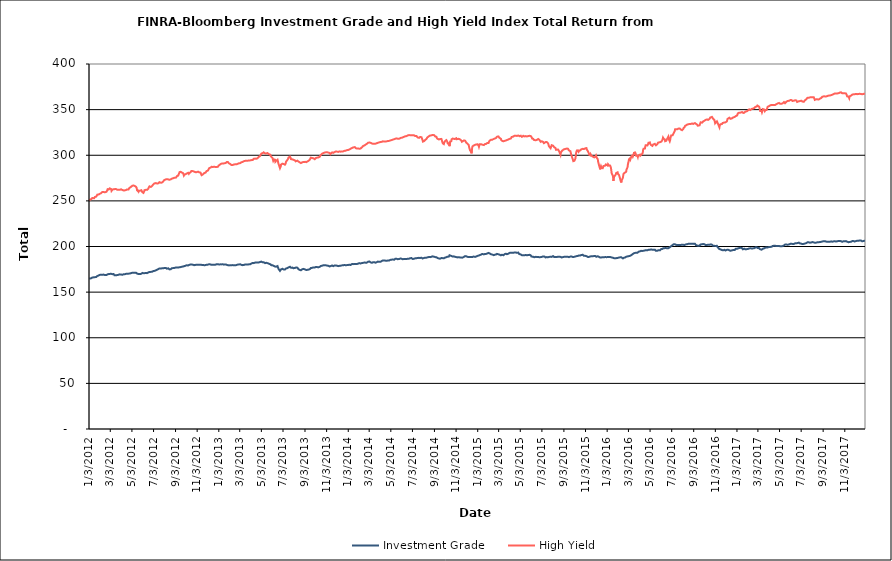
| Category | Investment Grade | High Yield |
|---|---|---|
| 1/3/12 | 165 | 250.715 |
| 1/4/12 | 164.79 | 250.779 |
| 1/5/12 | 164.735 | 251.086 |
| 1/6/12 | 164.96 | 251.448 |
| 1/9/12 | 165.268 | 251.961 |
| 1/10/12 | 165.441 | 252.742 |
| 1/11/12 | 165.803 | 252.832 |
| 1/12/12 | 166.032 | 253.184 |
| 1/13/12 | 166.183 | 253.02 |
| 1/17/12 | 166.274 | 252.866 |
| 1/18/12 | 166.444 | 253.06 |
| 1/19/12 | 166.456 | 254.263 |
| 1/20/12 | 166.437 | 254.397 |
| 1/23/12 | 166.529 | 254.743 |
| 1/24/12 | 166.417 | 254.88 |
| 1/25/12 | 166.929 | 255.446 |
| 1/26/12 | 167.686 | 256.822 |
| 1/27/12 | 167.976 | 256.959 |
| 1/30/12 | 168.315 | 257.005 |
| 1/31/12 | 168.58 | 256.808 |
| 2/1/12 | 168.573 | 257.523 |
| 2/2/12 | 168.91 | 257.778 |
| 2/3/12 | 168.745 | 257.951 |
| 2/6/12 | 169.019 | 258.538 |
| 2/7/12 | 168.872 | 258.607 |
| 2/8/12 | 169.153 | 259.455 |
| 2/9/12 | 168.938 | 259.817 |
| 2/10/12 | 169.066 | 259.132 |
| 2/13/12 | 169.249 | 259.743 |
| 2/14/12 | 169.29 | 259.486 |
| 2/15/12 | 169.329 | 259.581 |
| 2/16/12 | 168.702 | 259.357 |
| 2/17/12 | 168.808 | 260.074 |
| 2/21/12 | 168.807 | 260.076 |
| 2/22/12 | 169.006 | 260.884 |
| 2/23/12 | 169.182 | 261.495 |
| 2/24/12 | 169.517 | 262.8 |
| 2/27/12 | 169.832 | 262.498 |
| 2/28/12 | 170.084 | 262.863 |
| 2/29/12 | 170.208 | 263.462 |
| 3/1/12 | 169.958 | 263.656 |
| 3/2/12 | 170.404 | 263.482 |
| 3/5/12 | 170.096 | 262.963 |
| 3/6/12 | 169.911 | 260.954 |
| 3/7/12 | 169.867 | 261.475 |
| 3/8/12 | 169.702 | 261.711 |
| 3/9/12 | 169.585 | 262.512 |
| 3/12/12 | 169.759 | 262.676 |
| 3/13/12 | 169.338 | 262.921 |
| 3/14/12 | 168.604 | 263.168 |
| 3/15/12 | 168.553 | 262.878 |
| 3/16/12 | 168.639 | 262.992 |
| 3/19/12 | 168.542 | 262.878 |
| 3/20/12 | 168.348 | 262.477 |
| 3/21/12 | 168.765 | 262.877 |
| 3/22/12 | 168.674 | 262.254 |
| 3/23/12 | 168.965 | 262.017 |
| 3/26/12 | 169.026 | 262.319 |
| 3/27/12 | 169.446 | 262.573 |
| 3/28/12 | 169.432 | 262.566 |
| 3/29/12 | 169.464 | 262.104 |
| 3/30/12 | 169.412 | 262.581 |
| 4/2/12 | 169.408 | 262.705 |
| 4/3/12 | 169.271 | 262.827 |
| 4/4/12 | 168.83 | 262.433 |
| 4/5/12 | 168.956 | 262 |
| 4/9/12 | 169.563 | 261.491 |
| 4/10/12 | 169.66 | 260.789 |
| 4/11/12 | 169.504 | 260.797 |
| 4/12/12 | 169.575 | 261.504 |
| 4/13/12 | 169.893 | 261.894 |
| 4/16/12 | 170.079 | 261.862 |
| 4/17/12 | 169.995 | 262.478 |
| 4/18/12 | 170.068 | 262.661 |
| 4/19/12 | 170.194 | 262.593 |
| 4/20/12 | 170.075 | 262.792 |
| 4/23/12 | 170.258 | 262.506 |
| 4/24/12 | 170.151 | 263.114 |
| 4/25/12 | 170.052 | 263.997 |
| 4/26/12 | 170.32 | 264.193 |
| 4/27/12 | 170.504 | 264.573 |
| 4/30/12 | 170.798 | 265.38 |
| 5/1/12 | 170.791 | 266.079 |
| 5/2/12 | 171.05 | 266.388 |
| 5/3/12 | 171.183 | 266.464 |
| 5/4/12 | 171.332 | 266.529 |
| 5/7/12 | 171.284 | 266.86 |
| 5/8/12 | 171.473 | 266.486 |
| 5/9/12 | 171.253 | 266.124 |
| 5/10/12 | 171.161 | 266.473 |
| 5/11/12 | 171.321 | 266.48 |
| 5/14/12 | 171.318 | 265.403 |
| 5/15/12 | 171.144 | 265.259 |
| 5/16/12 | 170.604 | 264.152 |
| 5/17/12 | 170.27 | 261.717 |
| 5/18/12 | 169.962 | 260.994 |
| 5/21/12 | 169.887 | 259.995 |
| 5/22/12 | 169.745 | 261.241 |
| 5/23/12 | 169.888 | 260.549 |
| 5/24/12 | 169.74 | 260.698 |
| 5/25/12 | 169.974 | 261.09 |
| 5/29/12 | 170.104 | 261.678 |
| 5/30/12 | 170.523 | 261.215 |
| 5/31/12 | 170.894 | 260.94 |
| 6/1/12 | 171.018 | 259.478 |
| 6/4/12 | 170.775 | 258.736 |
| 6/5/12 | 170.482 | 258.384 |
| 6/6/12 | 170.426 | 260.187 |
| 6/7/12 | 170.775 | 261.74 |
| 6/8/12 | 170.965 | 261.457 |
| 6/11/12 | 171.032 | 262.151 |
| 6/12/12 | 170.646 | 261.8 |
| 6/13/12 | 170.807 | 262.045 |
| 6/14/12 | 170.791 | 262.064 |
| 6/15/12 | 171.482 | 262.908 |
| 6/18/12 | 171.637 | 263.399 |
| 6/19/12 | 171.659 | 264.743 |
| 6/20/12 | 171.768 | 265.827 |
| 6/21/12 | 172.115 | 265.94 |
| 6/22/12 | 172.025 | 265.728 |
| 6/25/12 | 172.199 | 265.279 |
| 6/26/12 | 172.058 | 265.524 |
| 6/27/12 | 172.152 | 265.968 |
| 6/28/12 | 172.304 | 266.213 |
| 6/29/12 | 172.257 | 267.309 |
| 7/2/12 | 173.09 | 268.096 |
| 7/3/12 | 173.221 | 268.752 |
| 7/5/12 | 173.316 | 269.146 |
| 7/6/12 | 173.56 | 269.538 |
| 7/9/12 | 173.833 | 269.493 |
| 7/10/12 | 174.086 | 269.579 |
| 7/11/12 | 174.259 | 269.722 |
| 7/12/12 | 174.453 | 269.04 |
| 7/13/12 | 174.699 | 269.154 |
| 7/16/12 | 175.24 | 269.239 |
| 7/17/12 | 175.328 | 269.334 |
| 7/18/12 | 175.845 | 269.69 |
| 7/19/12 | 175.973 | 270.505 |
| 7/20/12 | 175.936 | 270.235 |
| 7/23/12 | 175.822 | 269.894 |
| 7/24/12 | 176.004 | 269.604 |
| 7/25/12 | 176.025 | 269.406 |
| 7/26/12 | 176.118 | 270.041 |
| 7/27/12 | 175.687 | 270.63 |
| 7/30/12 | 176.107 | 271.303 |
| 7/31/12 | 176.44 | 272.05 |
| 8/1/12 | 176.338 | 272.672 |
| 8/2/12 | 176.512 | 272.465 |
| 8/3/12 | 176.119 | 272.799 |
| 8/6/12 | 176.532 | 273.572 |
| 8/7/12 | 176.104 | 274.005 |
| 8/8/12 | 175.944 | 273.748 |
| 8/9/12 | 175.686 | 273.786 |
| 8/10/12 | 176.002 | 273.401 |
| 8/13/12 | 176.09 | 273.532 |
| 8/14/12 | 175.65 | 273.594 |
| 8/15/12 | 175.071 | 273.101 |
| 8/16/12 | 174.906 | 273.147 |
| 8/17/12 | 174.987 | 273.072 |
| 8/20/12 | 175.143 | 273.57 |
| 8/21/12 | 175.21 | 274.034 |
| 8/22/12 | 175.778 | 274.203 |
| 8/23/12 | 176.169 | 274.362 |
| 8/24/12 | 176.127 | 274.551 |
| 8/27/12 | 176.358 | 274.825 |
| 8/28/12 | 176.454 | 275.031 |
| 8/29/12 | 176.284 | 274.914 |
| 8/30/12 | 176.477 | 275.32 |
| 8/31/12 | 176.81 | 275.392 |
| 9/4/12 | 177.032 | 275.567 |
| 9/5/12 | 176.91 | 275.631 |
| 9/6/12 | 176.68 | 276.312 |
| 9/7/12 | 177.103 | 277.344 |
| 9/10/12 | 177.002 | 277.72 |
| 9/11/12 | 177.098 | 278.556 |
| 9/12/12 | 177.05 | 279.736 |
| 9/13/12 | 177.212 | 280.396 |
| 9/14/12 | 177.169 | 281.535 |
| 9/17/12 | 177.454 | 281.887 |
| 9/18/12 | 177.646 | 281.586 |
| 9/19/12 | 177.912 | 281.618 |
| 9/20/12 | 177.78 | 281.149 |
| 9/21/12 | 177.838 | 281.063 |
| 9/24/12 | 178.1 | 280.276 |
| 9/25/12 | 178.087 | 279.718 |
| 9/26/12 | 178.216 | 277.714 |
| 9/27/12 | 178.469 | 278.535 |
| 9/28/12 | 178.688 | 278.908 |
| 10/1/12 | 178.975 | 279.276 |
| 10/2/12 | 179.149 | 279.208 |
| 10/3/12 | 179.331 | 279.587 |
| 10/4/12 | 179.471 | 279.992 |
| 10/5/12 | 179.287 | 280.375 |
| 10/8/12 | 179.17 | 280.811 |
| 10/9/12 | 179.42 | 280.214 |
| 10/10/12 | 179.403 | 279.596 |
| 10/11/12 | 179.787 | 280.444 |
| 10/12/12 | 180.286 | 280.729 |
| 10/15/12 | 180.386 | 281.353 |
| 10/16/12 | 180.411 | 281.917 |
| 10/17/12 | 180.427 | 282.705 |
| 10/18/12 | 180.252 | 282.93 |
| 10/19/12 | 180.181 | 282.592 |
| 10/22/12 | 179.984 | 282.579 |
| 10/23/12 | 179.808 | 281.491 |
| 10/24/12 | 179.787 | 281.88 |
| 10/25/12 | 179.532 | 282.013 |
| 10/26/12 | 179.776 | 281.343 |
| 10/29/12 | 179.874 | 281.464 |
| 10/30/12 | 179.896 | 281.521 |
| 10/31/12 | 180.158 | 281.409 |
| 11/1/12 | 180.105 | 281.505 |
| 11/2/12 | 180.019 | 281.845 |
| 11/5/12 | 180.13 | 282.006 |
| 11/6/12 | 179.794 | 282.389 |
| 11/7/12 | 179.95 | 281.412 |
| 11/8/12 | 180.011 | 281.342 |
| 11/9/12 | 179.956 | 280.712 |
| 11/12/12 | 179.993 | 281.011 |
| 11/13/12 | 180.036 | 279.914 |
| 11/14/12 | 180.015 | 279.447 |
| 11/15/12 | 179.863 | 278.145 |
| 11/16/12 | 179.799 | 277.878 |
| 11/19/12 | 179.795 | 279.127 |
| 11/20/12 | 179.615 | 279.948 |
| 11/21/12 | 179.343 | 280.164 |
| 11/23/12 | 179.415 | 280.637 |
| 11/26/12 | 179.727 | 280.898 |
| 11/27/12 | 179.835 | 281.598 |
| 11/28/12 | 179.951 | 281.767 |
| 11/29/12 | 179.975 | 282.593 |
| 11/30/12 | 180.118 | 283.394 |
| 12/3/12 | 180.152 | 283.319 |
| 12/4/12 | 180.225 | 283.828 |
| 12/5/12 | 180.496 | 284.899 |
| 12/6/12 | 180.562 | 285.395 |
| 12/7/12 | 180.315 | 286.027 |
| 12/10/12 | 180.348 | 286.385 |
| 12/11/12 | 180.223 | 286.768 |
| 12/12/12 | 180.123 | 287.14 |
| 12/13/12 | 179.907 | 287.331 |
| 12/14/12 | 180.071 | 287.179 |
| 12/17/12 | 179.933 | 287.169 |
| 12/18/12 | 179.627 | 287.436 |
| 12/19/12 | 179.934 | 287.562 |
| 12/20/12 | 179.999 | 287.474 |
| 12/21/12 | 180.203 | 286.963 |
| 12/24/12 | 180.079 | 287.133 |
| 12/26/12 | 180.197 | 286.749 |
| 12/27/12 | 180.542 | 287.091 |
| 12/28/12 | 180.711 | 287.206 |
| 12/31/12 | 180.615 | 287.373 |
| 1/2/13 | 180.418 | 288.714 |
| 1/3/13 | 180.314 | 289.229 |
| 1/4/13 | 180.218 | 289.691 |
| 1/7/13 | 180.416 | 290.115 |
| 1/8/13 | 180.534 | 290.229 |
| 1/9/13 | 180.497 | 290.492 |
| 1/10/13 | 180.403 | 290.811 |
| 1/11/13 | 180.366 | 291.068 |
| 1/14/13 | 180.474 | 290.972 |
| 1/15/13 | 180.457 | 290.556 |
| 1/16/13 | 180.451 | 290.825 |
| 1/17/13 | 180.126 | 291.101 |
| 1/18/13 | 180.262 | 291.424 |
| 1/22/13 | 180.359 | 291.542 |
| 1/23/13 | 180.414 | 291.942 |
| 1/24/13 | 180.258 | 292.239 |
| 1/25/13 | 179.88 | 292.639 |
| 1/28/13 | 179.528 | 292.699 |
| 1/29/13 | 179.475 | 291.968 |
| 1/30/13 | 179.216 | 291.435 |
| 1/31/13 | 179.282 | 290.547 |
| 2/1/13 | 179.319 | 290.795 |
| 2/4/13 | 179.396 | 290.328 |
| 2/5/13 | 179.186 | 289.927 |
| 2/6/13 | 179.33 | 289.626 |
| 2/7/13 | 179.53 | 289.348 |
| 2/8/13 | 179.424 | 289.123 |
| 2/11/13 | 179.601 | 289.312 |
| 2/12/13 | 179.432 | 289.517 |
| 2/13/13 | 179.276 | 289.685 |
| 2/14/13 | 179.47 | 289.903 |
| 2/15/13 | 179.428 | 289.938 |
| 2/19/13 | 179.436 | 290.138 |
| 2/20/13 | 179.393 | 290.311 |
| 2/21/13 | 179.67 | 289.894 |
| 2/22/13 | 179.791 | 290.126 |
| 2/25/13 | 180.195 | 290.674 |
| 2/26/13 | 180.36 | 290.49 |
| 2/27/13 | 180.275 | 290.647 |
| 2/28/13 | 180.295 | 291.129 |
| 3/1/13 | 180.498 | 291.056 |
| 3/4/13 | 180.547 | 291.371 |
| 3/5/13 | 180.405 | 292.183 |
| 3/6/13 | 180.162 | 292.263 |
| 3/7/13 | 179.864 | 292.342 |
| 3/8/13 | 179.491 | 292.364 |
| 3/11/13 | 179.561 | 292.71 |
| 3/12/13 | 179.833 | 292.986 |
| 3/13/13 | 179.763 | 292.997 |
| 3/14/13 | 179.781 | 293.521 |
| 3/15/13 | 180.017 | 293.66 |
| 3/18/13 | 180.309 | 293.843 |
| 3/19/13 | 180.56 | 293.925 |
| 3/20/13 | 180.234 | 294.009 |
| 3/21/13 | 180.19 | 293.882 |
| 3/22/13 | 180.169 | 293.97 |
| 3/25/13 | 180.202 | 294.027 |
| 3/26/13 | 180.105 | 293.998 |
| 3/27/13 | 180.419 | 294.128 |
| 3/28/13 | 180.443 | 294.272 |
| 4/1/13 | 180.531 | 294.371 |
| 4/2/13 | 180.461 | 294.579 |
| 4/3/13 | 180.789 | 294.607 |
| 4/4/13 | 181.285 | 294.648 |
| 4/5/13 | 181.945 | 294.632 |
| 4/8/13 | 182.004 | 294.735 |
| 4/9/13 | 182.049 | 295.329 |
| 4/10/13 | 181.764 | 295.607 |
| 4/11/13 | 181.777 | 296.149 |
| 4/12/13 | 182.134 | 296.506 |
| 4/15/13 | 182.382 | 296.343 |
| 4/16/13 | 182.309 | 296.556 |
| 4/17/13 | 182.364 | 296.241 |
| 4/18/13 | 182.416 | 296.14 |
| 4/19/13 | 182.332 | 296.394 |
| 4/22/13 | 182.498 | 296.78 |
| 4/23/13 | 182.612 | 297.392 |
| 4/24/13 | 182.699 | 297.751 |
| 4/25/13 | 182.517 | 298.19 |
| 4/26/13 | 182.907 | 298.71 |
| 4/29/13 | 183.005 | 299.268 |
| 4/30/13 | 183.021 | 300.067 |
| 5/1/13 | 183.331 | 300.856 |
| 5/2/13 | 183.461 | 301.386 |
| 5/3/13 | 182.88 | 301.968 |
| 5/6/13 | 182.703 | 302.267 |
| 5/7/13 | 182.682 | 302.749 |
| 5/8/13 | 182.755 | 303.216 |
| 5/9/13 | 182.747 | 303.174 |
| 5/10/13 | 182.048 | 302.716 |
| 5/13/13 | 181.775 | 302.027 |
| 5/14/13 | 181.74 | 301.767 |
| 5/15/13 | 181.725 | 301.705 |
| 5/16/13 | 182.182 | 302.013 |
| 5/17/13 | 181.879 | 302.136 |
| 5/20/13 | 181.74 | 302.424 |
| 5/21/13 | 181.831 | 302.406 |
| 5/22/13 | 181.51 | 302.291 |
| 5/23/13 | 181.254 | 301.321 |
| 5/24/13 | 181.269 | 300.988 |
| 5/28/13 | 180.478 | 300.573 |
| 5/29/13 | 179.983 | 298.941 |
| 5/30/13 | 179.917 | 298.874 |
| 5/31/13 | 179.394 | 298.159 |
| 6/3/13 | 179.454 | 296.868 |
| 6/4/13 | 179.162 | 296.146 |
| 6/5/13 | 178.829 | 293.959 |
| 6/6/13 | 178.861 | 293.342 |
| 6/7/13 | 178.695 | 295.478 |
| 6/10/13 | 178.13 | 295.107 |
| 6/11/13 | 177.577 | 292.825 |
| 6/12/13 | 177.663 | 293.39 |
| 6/13/13 | 177.842 | 292.841 |
| 6/14/13 | 178.613 | 294.18 |
| 6/17/13 | 178.554 | 295.091 |
| 6/18/13 | 178.04 | 294.81 |
| 6/19/13 | 177.631 | 294.581 |
| 6/20/13 | 175.366 | 290.384 |
| 6/21/13 | 174.752 | 289.646 |
| 6/24/13 | 173.249 | 285.828 |
| 6/25/13 | 173.543 | 286.221 |
| 6/26/13 | 174.232 | 287.65 |
| 6/27/13 | 174.959 | 289.73 |
| 6/28/13 | 175.137 | 290.228 |
| 7/1/13 | 175.576 | 290.788 |
| 7/2/13 | 175.941 | 291.105 |
| 7/3/13 | 175.988 | 290.585 |
| 7/5/13 | 174.738 | 290.273 |
| 7/8/13 | 174.822 | 289.667 |
| 7/9/13 | 175.184 | 290.346 |
| 7/10/13 | 175.151 | 290.844 |
| 7/11/13 | 175.898 | 292.926 |
| 7/12/13 | 176.14 | 293.609 |
| 7/15/13 | 176.351 | 294.919 |
| 7/16/13 | 176.666 | 295.47 |
| 7/17/13 | 177.121 | 296.161 |
| 7/18/13 | 177.12 | 297.519 |
| 7/19/13 | 177.42 | 297.862 |
| 7/22/13 | 177.769 | 298.556 |
| 7/23/13 | 177.698 | 298.585 |
| 7/24/13 | 176.991 | 297.183 |
| 7/25/13 | 176.669 | 295.729 |
| 7/26/13 | 177.005 | 295.673 |
| 7/29/13 | 176.886 | 295.5 |
| 7/30/13 | 176.857 | 295.631 |
| 7/31/13 | 176.508 | 295.054 |
| 8/1/13 | 176.191 | 295.026 |
| 8/2/13 | 176.666 | 294.693 |
| 8/5/13 | 176.529 | 294.436 |
| 8/6/13 | 176.451 | 293.84 |
| 8/7/13 | 176.654 | 293.33 |
| 8/8/13 | 176.91 | 293.6 |
| 8/9/13 | 176.889 | 293.805 |
| 8/12/13 | 176.834 | 294.05 |
| 8/13/13 | 176.01 | 293.634 |
| 8/14/13 | 175.868 | 293.796 |
| 8/15/13 | 175.063 | 293.112 |
| 8/16/13 | 174.752 | 292.875 |
| 8/19/13 | 174.276 | 292.095 |
| 8/20/13 | 174.561 | 291.862 |
| 8/21/13 | 174.282 | 291.78 |
| 8/22/13 | 173.987 | 291.473 |
| 8/23/13 | 174.557 | 291.996 |
| 8/26/13 | 175.088 | 292.307 |
| 8/27/13 | 175.55 | 292.162 |
| 8/28/13 | 175.33 | 292.241 |
| 8/29/13 | 175.469 | 292.563 |
| 8/30/13 | 175.752 | 293.08 |
| 9/3/13 | 174.857 | 292.778 |
| 9/4/13 | 174.803 | 292.764 |
| 9/5/13 | 173.839 | 292.314 |
| 9/6/13 | 174.212 | 292.438 |
| 9/9/13 | 174.432 | 293.107 |
| 9/10/13 | 174.027 | 293 |
| 9/11/13 | 174.23 | 293.246 |
| 9/12/13 | 174.624 | 293.821 |
| 9/13/13 | 174.528 | 294.088 |
| 9/16/13 | 175.136 | 295.082 |
| 9/17/13 | 175.056 | 295.217 |
| 9/18/13 | 175.426 | 295.876 |
| 9/19/13 | 176.394 | 297.362 |
| 9/20/13 | 176.442 | 297.438 |
| 9/23/13 | 176.64 | 296.94 |
| 9/24/13 | 177.073 | 297.042 |
| 9/25/13 | 177.29 | 296.788 |
| 9/26/13 | 177.116 | 296.649 |
| 9/27/13 | 177.17 | 296.298 |
| 9/30/13 | 177.029 | 295.684 |
| 10/1/13 | 177.035 | 296.078 |
| 10/2/13 | 177.315 | 296.334 |
| 10/3/13 | 177.535 | 296.928 |
| 10/4/13 | 177.247 | 297.16 |
| 10/7/13 | 177.419 | 297.396 |
| 10/8/13 | 177.369 | 297.091 |
| 10/9/13 | 177.218 | 296.983 |
| 10/10/13 | 177.152 | 297.583 |
| 10/11/13 | 177.569 | 298.016 |
| 10/14/13 | 177.705 | 298.362 |
| 10/15/13 | 177.422 | 298.46 |
| 10/16/13 | 177.683 | 299.078 |
| 10/17/13 | 178.623 | 300.339 |
| 10/18/13 | 179.055 | 301.275 |
| 10/21/13 | 178.946 | 301.75 |
| 10/22/13 | 179.5 | 302.295 |
| 10/23/13 | 179.642 | 302.152 |
| 10/24/13 | 179.451 | 302.314 |
| 10/25/13 | 179.509 | 302.45 |
| 10/28/13 | 179.497 | 302.947 |
| 10/29/13 | 179.506 | 303.014 |
| 10/30/13 | 179.7 | 303.179 |
| 10/31/13 | 179.418 | 303.199 |
| 11/1/13 | 179.055 | 302.946 |
| 11/4/13 | 179.086 | 303.346 |
| 11/5/13 | 178.619 | 302.838 |
| 11/6/13 | 178.743 | 302.912 |
| 11/7/13 | 178.912 | 302.935 |
| 11/8/13 | 178.027 | 302.168 |
| 11/11/13 | 178.148 | 302.481 |
| 11/12/13 | 177.732 | 301.574 |
| 11/13/13 | 178.044 | 301.25 |
| 11/14/13 | 178.581 | 301.928 |
| 11/15/13 | 178.699 | 302.34 |
| 11/18/13 | 179.216 | 303.154 |
| 11/19/13 | 179.056 | 303.064 |
| 11/20/13 | 178.763 | 302.951 |
| 11/21/13 | 178.483 | 302.637 |
| 11/22/13 | 178.866 | 303.162 |
| 11/25/13 | 179.18 | 303.49 |
| 11/26/13 | 179.447 | 303.451 |
| 11/27/13 | 179.295 | 303.964 |
| 11/29/13 | 179.243 | 304.187 |
| 12/2/13 | 178.936 | 303.959 |
| 12/3/13 | 179.077 | 304.022 |
| 12/4/13 | 178.638 | 303.759 |
| 12/5/13 | 178.482 | 303.661 |
| 12/6/13 | 178.524 | 303.958 |
| 12/9/13 | 178.794 | 304.229 |
| 12/10/13 | 179.26 | 304.454 |
| 12/11/13 | 179.244 | 304.384 |
| 12/12/13 | 178.971 | 303.923 |
| 12/13/13 | 179.064 | 304.033 |
| 12/16/13 | 179.328 | 304.232 |
| 12/17/13 | 179.548 | 304.208 |
| 12/18/13 | 179.531 | 304.127 |
| 12/19/13 | 179.415 | 304.237 |
| 12/20/13 | 179.659 | 304.524 |
| 12/23/13 | 179.774 | 304.868 |
| 12/24/13 | 179.596 | 304.866 |
| 12/26/13 | 179.421 | 304.99 |
| 12/27/13 | 179.346 | 305.23 |
| 12/30/13 | 179.619 | 305.626 |
| 12/31/13 | 179.735 | 305.727 |
| 1/2/14 | 179.728 | 305.662 |
| 1/3/14 | 179.753 | 305.864 |
| 1/6/14 | 180.039 | 306.408 |
| 1/7/14 | 180.116 | 306.94 |
| 1/8/14 | 179.579 | 306.969 |
| 1/9/14 | 179.671 | 307.098 |
| 1/10/14 | 180.4 | 307.505 |
| 1/13/14 | 180.811 | 307.909 |
| 1/14/14 | 180.596 | 307.963 |
| 1/15/14 | 180.41 | 308.397 |
| 1/16/14 | 180.672 | 308.499 |
| 1/17/14 | 180.742 | 308.963 |
| 1/21/14 | 180.804 | 308.937 |
| 1/22/14 | 180.542 | 309.084 |
| 1/23/14 | 180.718 | 308.76 |
| 1/24/14 | 180.846 | 307.697 |
| 1/27/14 | 180.803 | 307.291 |
| 1/28/14 | 180.86 | 307.421 |
| 1/29/14 | 181.147 | 307.34 |
| 1/30/14 | 181.221 | 307.5 |
| 1/31/14 | 181.355 | 307.291 |
| 2/3/14 | 181.763 | 307.131 |
| 2/4/14 | 181.689 | 307.001 |
| 2/5/14 | 181.423 | 306.844 |
| 2/6/14 | 181.395 | 307.294 |
| 2/7/14 | 181.768 | 308.141 |
| 2/10/14 | 181.871 | 308.736 |
| 2/11/14 | 181.686 | 309.108 |
| 2/12/14 | 181.564 | 309.671 |
| 2/13/14 | 182.068 | 309.957 |
| 2/14/14 | 182.2 | 310.47 |
| 2/18/14 | 182.466 | 310.993 |
| 2/19/14 | 182.465 | 311.258 |
| 2/20/14 | 182.013 | 311.434 |
| 2/21/14 | 182.187 | 311.855 |
| 2/24/14 | 182.309 | 312.532 |
| 2/25/14 | 182.786 | 313.061 |
| 2/26/14 | 182.966 | 313.386 |
| 2/27/14 | 183.242 | 313.688 |
| 2/28/14 | 183.242 | 313.95 |
| 3/3/14 | 183.617 | 313.958 |
| 3/4/14 | 183.201 | 314.086 |
| 3/5/14 | 183.098 | 314.146 |
| 3/6/14 | 182.707 | 313.68 |
| 3/7/14 | 182.162 | 313.23 |
| 3/10/14 | 182.161 | 312.94 |
| 3/11/14 | 182.18 | 312.996 |
| 3/12/14 | 182.373 | 312.805 |
| 3/13/14 | 182.68 | 312.601 |
| 3/14/14 | 182.791 | 312.17 |
| 3/17/14 | 182.764 | 312.694 |
| 3/18/14 | 182.841 | 312.994 |
| 3/19/14 | 182.684 | 313.321 |
| 3/20/14 | 182.283 | 312.665 |
| 3/21/14 | 182.579 | 313.2 |
| 3/24/14 | 182.821 | 313.213 |
| 3/25/14 | 182.966 | 313.327 |
| 3/26/14 | 183.239 | 313.866 |
| 3/27/14 | 183.453 | 313.624 |
| 3/28/14 | 183.28 | 313.939 |
| 3/31/14 | 183.295 | 314.186 |
| 4/1/14 | 183.326 | 314.175 |
| 4/2/14 | 182.944 | 314.368 |
| 4/3/14 | 183.181 | 314.462 |
| 4/4/14 | 183.667 | 314.772 |
| 4/7/14 | 184.06 | 314.72 |
| 4/8/14 | 184.138 | 314.878 |
| 4/9/14 | 184.201 | 315.146 |
| 4/10/14 | 184.696 | 315.282 |
| 4/11/14 | 184.791 | 314.863 |
| 4/14/14 | 184.777 | 315.029 |
| 4/15/14 | 184.821 | 314.902 |
| 4/16/14 | 184.74 | 315.02 |
| 4/17/14 | 184.509 | 315.085 |
| 4/21/14 | 184.449 | 315.235 |
| 4/22/14 | 184.345 | 315.366 |
| 4/23/14 | 184.609 | 315.544 |
| 4/24/14 | 184.557 | 315.604 |
| 4/25/14 | 184.79 | 315.711 |
| 4/28/14 | 184.686 | 315.777 |
| 4/29/14 | 184.555 | 315.908 |
| 4/30/14 | 184.879 | 316.245 |
| 5/1/14 | 185.332 | 316.202 |
| 5/2/14 | 185.496 | 316.636 |
| 5/5/14 | 185.588 | 316.655 |
| 5/6/14 | 185.606 | 316.793 |
| 5/7/14 | 185.64 | 316.933 |
| 5/8/14 | 185.782 | 317.079 |
| 5/9/14 | 185.695 | 317.384 |
| 5/12/14 | 185.477 | 317.601 |
| 5/13/14 | 185.77 | 317.893 |
| 5/14/14 | 186.391 | 318.157 |
| 5/15/14 | 186.658 | 318.079 |
| 5/16/14 | 186.536 | 318.037 |
| 5/19/14 | 186.535 | 318.482 |
| 5/20/14 | 186.465 | 318.324 |
| 5/21/14 | 186.201 | 318.324 |
| 5/22/14 | 186.056 | 318.13 |
| 5/23/14 | 186.327 | 318.26 |
| 5/27/14 | 186.419 | 318.216 |
| 5/28/14 | 187.106 | 318.396 |
| 5/29/14 | 187.185 | 318.6 |
| 5/30/14 | 186.936 | 318.99 |
| 6/2/14 | 186.525 | 319.196 |
| 6/3/14 | 186.096 | 318.824 |
| 6/4/14 | 185.923 | 318.923 |
| 6/5/14 | 186.096 | 319.519 |
| 6/6/14 | 186.357 | 319.906 |
| 6/9/14 | 186.269 | 320.267 |
| 6/10/14 | 186.071 | 320.527 |
| 6/11/14 | 186.117 | 320.701 |
| 6/12/14 | 186.209 | 320.732 |
| 6/13/14 | 186.298 | 320.741 |
| 6/16/14 | 186.394 | 321.02 |
| 6/17/14 | 186.061 | 320.916 |
| 6/18/14 | 186.227 | 321.023 |
| 6/19/14 | 186.477 | 321.712 |
| 6/20/14 | 186.358 | 321.828 |
| 6/23/14 | 186.687 | 322.129 |
| 6/24/14 | 186.768 | 322.229 |
| 6/25/14 | 187.112 | 322.061 |
| 6/26/14 | 187.237 | 321.92 |
| 6/27/14 | 187.246 | 321.907 |
| 6/30/14 | 187.28 | 321.988 |
| 7/1/14 | 186.985 | 321.994 |
| 7/2/14 | 186.597 | 321.974 |
| 7/3/14 | 186.327 | 321.934 |
| 7/7/14 | 186.526 | 321.932 |
| 7/8/14 | 186.93 | 321.735 |
| 7/9/14 | 186.875 | 321.432 |
| 7/10/14 | 187.101 | 320.961 |
| 7/11/14 | 187.261 | 320.984 |
| 7/14/14 | 187.168 | 320.983 |
| 7/15/14 | 187.05 | 320.744 |
| 7/16/14 | 187.124 | 320.402 |
| 7/17/14 | 187.478 | 319.546 |
| 7/18/14 | 187.415 | 319.119 |
| 7/21/14 | 187.552 | 319.067 |
| 7/22/14 | 187.59 | 319.413 |
| 7/23/14 | 187.802 | 320.013 |
| 7/24/14 | 187.45 | 320.044 |
| 7/25/14 | 187.698 | 320.029 |
| 7/28/14 | 187.674 | 319.769 |
| 7/29/14 | 187.837 | 319.656 |
| 7/30/14 | 187.301 | 319.047 |
| 7/31/14 | 186.886 | 316.528 |
| 8/1/14 | 187.092 | 314.942 |
| 8/4/14 | 187.413 | 315.476 |
| 8/5/14 | 187.252 | 316.358 |
| 8/6/14 | 187.363 | 316.277 |
| 8/7/14 | 187.673 | 316.579 |
| 8/8/14 | 187.896 | 316.826 |
| 8/11/14 | 187.77 | 317.856 |
| 8/12/14 | 187.676 | 318.383 |
| 8/13/14 | 187.876 | 319.344 |
| 8/14/14 | 188.161 | 319.663 |
| 8/15/14 | 188.62 | 319.986 |
| 8/18/14 | 188.479 | 320.831 |
| 8/19/14 | 188.396 | 321.336 |
| 8/20/14 | 188.206 | 321.492 |
| 8/21/14 | 188.347 | 321.61 |
| 8/22/14 | 188.447 | 321.622 |
| 8/25/14 | 188.701 | 321.818 |
| 8/26/14 | 188.792 | 322.093 |
| 8/27/14 | 188.959 | 322.039 |
| 8/28/14 | 189.247 | 322.212 |
| 8/29/14 | 189.332 | 322.307 |
| 9/2/14 | 188.727 | 321.963 |
| 9/3/14 | 188.618 | 321.632 |
| 9/4/14 | 188.349 | 321.109 |
| 9/5/14 | 188.346 | 320.463 |
| 9/8/14 | 188.284 | 320.285 |
| 9/9/14 | 187.806 | 319.5 |
| 9/10/14 | 187.427 | 318.374 |
| 9/11/14 | 187.429 | 317.872 |
| 9/12/14 | 186.837 | 317.625 |
| 9/15/14 | 186.884 | 317.32 |
| 9/16/14 | 186.942 | 316.989 |
| 9/17/14 | 186.928 | 317.395 |
| 9/18/14 | 186.65 | 317.716 |
| 9/19/14 | 186.954 | 318.104 |
| 9/22/14 | 187.276 | 317.886 |
| 9/23/14 | 187.426 | 316.785 |
| 9/24/14 | 187.209 | 316.242 |
| 9/25/14 | 187.279 | 314.369 |
| 9/26/14 | 186.843 | 313.067 |
| 9/29/14 | 187.044 | 312.227 |
| 9/30/14 | 187.078 | 313.839 |
| 10/1/14 | 187.741 | 314.5 |
| 10/2/14 | 187.805 | 314.68 |
| 10/3/14 | 187.775 | 315.764 |
| 10/6/14 | 188.229 | 316.652 |
| 10/7/14 | 188.613 | 315.906 |
| 10/8/14 | 188.736 | 315.449 |
| 10/9/14 | 188.86 | 314.322 |
| 10/10/14 | 188.827 | 312.945 |
| 10/13/14 | 188.921 | 313.229 |
| 10/14/14 | 189.474 | 311.473 |
| 10/15/14 | 190.361 | 309.937 |
| 10/16/14 | 189.617 | 311.032 |
| 10/17/14 | 189.527 | 315.087 |
| 10/20/14 | 189.692 | 315.391 |
| 10/21/14 | 189.622 | 317.481 |
| 10/22/14 | 189.473 | 317.828 |
| 10/23/14 | 189.056 | 318.169 |
| 10/24/14 | 189.113 | 318.268 |
| 10/27/14 | 189.192 | 317.999 |
| 10/28/14 | 189.053 | 318.308 |
| 10/29/14 | 188.673 | 318.003 |
| 10/30/14 | 188.788 | 317.85 |
| 10/31/14 | 188.531 | 318.489 |
| 11/3/14 | 188.389 | 318.666 |
| 11/4/14 | 188.42 | 317.568 |
| 11/5/14 | 188.206 | 317.764 |
| 11/6/14 | 188.056 | 317.831 |
| 11/7/14 | 188.309 | 317.73 |
| 11/10/14 | 188.303 | 318.028 |
| 11/11/14 | 188.337 | 318.366 |
| 11/12/14 | 188.151 | 317.973 |
| 11/13/14 | 188.062 | 317.544 |
| 11/14/14 | 188.002 | 316.97 |
| 11/17/14 | 187.855 | 316.264 |
| 11/18/14 | 187.783 | 315.504 |
| 11/19/14 | 187.533 | 314.749 |
| 11/20/14 | 187.762 | 314.823 |
| 11/21/14 | 188.187 | 315.646 |
| 11/24/14 | 188.506 | 316.096 |
| 11/25/14 | 188.832 | 316.289 |
| 11/26/14 | 189.221 | 316.481 |
| 11/28/14 | 189.453 | 316.019 |
| 12/1/14 | 189.339 | 313.923 |
| 12/2/14 | 188.594 | 312.837 |
| 12/3/14 | 188.505 | 313.025 |
| 12/4/14 | 188.701 | 312.974 |
| 12/5/14 | 188.301 | 312.533 |
| 12/8/14 | 188.448 | 311.404 |
| 12/9/14 | 188.664 | 309.375 |
| 12/10/14 | 188.681 | 307.796 |
| 12/11/14 | 188.559 | 307.125 |
| 12/12/14 | 188.929 | 305.319 |
| 12/15/14 | 188.561 | 303.76 |
| 12/16/14 | 188.411 | 302.104 |
| 12/17/14 | 188.632 | 304.814 |
| 12/18/14 | 188.376 | 308.594 |
| 12/19/14 | 188.733 | 309.774 |
| 12/22/14 | 188.996 | 310.688 |
| 12/23/14 | 188.785 | 311.246 |
| 12/24/14 | 188.507 | 311.397 |
| 12/26/14 | 188.632 | 311.433 |
| 12/29/14 | 188.966 | 311.834 |
| 12/30/14 | 189.326 | 311.52 |
| 12/31/14 | 189.333 | 311.585 |
| 1/2/15 | 189.707 | 311.981 |
| 1/5/15 | 190.061 | 310.514 |
| 1/6/15 | 190.617 | 309.236 |
| 1/7/15 | 190.665 | 310.323 |
| 1/8/15 | 190.51 | 312.032 |
| 1/9/15 | 190.821 | 312.279 |
| 1/12/15 | 191.135 | 312.116 |
| 1/13/15 | 191.197 | 311.828 |
| 1/14/15 | 191.521 | 311.162 |
| 1/15/15 | 191.841 | 311.605 |
| 1/16/15 | 191.445 | 311.391 |
| 1/20/15 | 191.389 | 311.144 |
| 1/21/15 | 191.221 | 311.199 |
| 1/22/15 | 191.103 | 311.857 |
| 1/23/15 | 191.851 | 312.326 |
| 1/26/15 | 191.9 | 312.417 |
| 1/27/15 | 192.1 | 312.884 |
| 1/28/15 | 192.361 | 313.314 |
| 1/29/15 | 192.305 | 313.305 |
| 1/30/15 | 192.95 | 313.334 |
| 2/2/15 | 192.968 | 313.318 |
| 2/3/15 | 192.453 | 314.525 |
| 2/4/15 | 192.202 | 315.219 |
| 2/5/15 | 192.42 | 315.883 |
| 2/6/15 | 191.635 | 316.843 |
| 2/9/15 | 191.513 | 316.93 |
| 2/10/15 | 191.119 | 317.059 |
| 2/11/15 | 191.011 | 316.766 |
| 2/12/15 | 191.228 | 316.948 |
| 2/13/15 | 191.17 | 317.553 |
| 2/17/15 | 190.516 | 317.925 |
| 2/18/15 | 190.732 | 318.48 |
| 2/19/15 | 190.899 | 318.317 |
| 2/20/15 | 191.064 | 318.426 |
| 2/23/15 | 191.233 | 318.871 |
| 2/24/15 | 191.796 | 319.378 |
| 2/25/15 | 192.095 | 319.888 |
| 2/26/15 | 191.89 | 320.343 |
| 2/27/15 | 191.784 | 320.609 |
| 3/2/15 | 191.428 | 320.621 |
| 3/3/15 | 191.217 | 320.166 |
| 3/4/15 | 191.071 | 319.366 |
| 3/5/15 | 191.13 | 319.372 |
| 3/6/15 | 190.188 | 318.446 |
| 3/9/15 | 190.354 | 317.968 |
| 3/10/15 | 190.614 | 316.558 |
| 3/11/15 | 190.601 | 316.519 |
| 3/12/15 | 190.908 | 316.885 |
| 3/13/15 | 190.461 | 315.689 |
| 3/16/15 | 190.47 | 315.333 |
| 3/17/15 | 190.485 | 314.448 |
| 3/18/15 | 191.067 | 314.742 |
| 3/19/15 | 191.54 | 315.682 |
| 3/20/15 | 191.822 | 315.866 |
| 3/23/15 | 192.11 | 316.214 |
| 3/24/15 | 192.44 | 316.861 |
| 3/25/15 | 192.239 | 316.964 |
| 3/26/15 | 191.565 | 316.677 |
| 3/27/15 | 191.862 | 317.03 |
| 3/30/15 | 192.098 | 317.31 |
| 3/31/15 | 192.401 | 317.42 |
| 4/1/15 | 193.098 | 317.516 |
| 4/2/15 | 193.003 | 317.916 |
| 4/6/15 | 193.061 | 318.403 |
| 4/7/15 | 193.189 | 319.183 |
| 4/8/15 | 193.294 | 319.982 |
| 4/9/15 | 193.065 | 319.944 |
| 4/10/15 | 193.121 | 320.249 |
| 4/13/15 | 193.1 | 320.514 |
| 4/14/15 | 193.634 | 320.559 |
| 4/15/15 | 193.607 | 321.112 |
| 4/16/15 | 193.507 | 321.387 |
| 4/17/15 | 193.596 | 321.137 |
| 4/20/15 | 193.52 | 321.448 |
| 4/21/15 | 193.485 | 321.42 |
| 4/22/15 | 193.004 | 321.095 |
| 4/23/15 | 193.028 | 321.187 |
| 4/24/15 | 193.376 | 321.481 |
| 4/27/15 | 193.341 | 321.656 |
| 4/28/15 | 192.898 | 321.552 |
| 4/29/15 | 191.919 | 321.035 |
| 4/30/15 | 191.641 | 320.923 |
| 5/1/15 | 191.347 | 320.985 |
| 5/4/15 | 191.24 | 321.415 |
| 5/5/15 | 190.804 | 321.24 |
| 5/6/15 | 190.311 | 320.599 |
| 5/7/15 | 190.486 | 320.138 |
| 5/8/15 | 191.114 | 321.066 |
| 5/11/15 | 190.518 | 321.303 |
| 5/12/15 | 190.062 | 320.241 |
| 5/13/15 | 190.17 | 320.532 |
| 5/14/15 | 190.341 | 320.675 |
| 5/15/15 | 191.128 | 321.09 |
| 5/18/15 | 190.766 | 321.013 |
| 5/19/15 | 190.19 | 320.685 |
| 5/20/15 | 190.072 | 320.346 |
| 5/21/15 | 190.363 | 320.591 |
| 5/22/15 | 190.34 | 320.969 |
| 5/26/15 | 190.75 | 321.078 |
| 5/27/15 | 190.746 | 321.085 |
| 5/28/15 | 190.768 | 320.932 |
| 5/29/15 | 190.858 | 321.287 |
| 6/1/15 | 190.299 | 321.112 |
| 6/2/15 | 189.535 | 320.755 |
| 6/3/15 | 188.981 | 320.082 |
| 6/4/15 | 189.213 | 319.441 |
| 6/5/15 | 188.734 | 318.312 |
| 6/8/15 | 188.775 | 317.984 |
| 6/9/15 | 188.302 | 317.115 |
| 6/10/15 | 187.769 | 316.776 |
| 6/11/15 | 188.261 | 317.519 |
| 6/12/15 | 188.635 | 317.054 |
| 6/15/15 | 188.648 | 316.418 |
| 6/16/15 | 188.708 | 316.12 |
| 6/17/15 | 188.537 | 316.3 |
| 6/18/15 | 188.609 | 316.722 |
| 6/19/15 | 189.116 | 317.238 |
| 6/22/15 | 188.628 | 317.811 |
| 6/23/15 | 188.3 | 317.684 |
| 6/24/15 | 188.338 | 317.368 |
| 6/25/15 | 188.237 | 317.021 |
| 6/26/15 | 187.822 | 316.337 |
| 6/29/15 | 188.375 | 314.703 |
| 6/30/15 | 188.681 | 314.864 |
| 7/1/15 | 188.274 | 315.1 |
| 7/2/15 | 188.576 | 315.355 |
| 7/6/15 | 189.147 | 314.576 |
| 7/7/15 | 189.675 | 313.726 |
| 7/8/15 | 189.613 | 313.221 |
| 7/9/15 | 189.158 | 313.623 |
| 7/10/15 | 188.346 | 313.933 |
| 7/13/15 | 188.004 | 314.451 |
| 7/14/15 | 188.086 | 314.425 |
| 7/15/15 | 188.263 | 314.773 |
| 7/16/15 | 188.395 | 314.607 |
| 7/17/15 | 188.539 | 313.541 |
| 7/20/15 | 188.252 | 313.008 |
| 7/21/15 | 188.364 | 311.89 |
| 7/22/15 | 188.518 | 310.158 |
| 7/23/15 | 188.582 | 309.546 |
| 7/24/15 | 188.713 | 309.053 |
| 7/27/15 | 188.742 | 307.675 |
| 7/28/15 | 188.674 | 307.681 |
| 7/29/15 | 188.468 | 309.739 |
| 7/30/15 | 188.615 | 311.038 |
| 7/31/15 | 189.136 | 310.99 |
| 8/3/15 | 189.44 | 310.44 |
| 8/4/15 | 189.213 | 310.662 |
| 8/5/15 | 188.525 | 310.156 |
| 8/6/15 | 188.549 | 308.888 |
| 8/7/15 | 188.722 | 307.831 |
| 8/10/15 | 188.414 | 307.899 |
| 8/11/15 | 188.993 | 306.132 |
| 8/12/15 | 188.87 | 305.253 |
| 8/13/15 | 188.469 | 306.097 |
| 8/14/15 | 188.452 | 306.11 |
| 8/17/15 | 188.806 | 306.314 |
| 8/18/15 | 188.592 | 306.318 |
| 8/19/15 | 188.512 | 305.434 |
| 8/20/15 | 188.837 | 304.431 |
| 8/21/15 | 188.933 | 303.589 |
| 8/24/15 | 188.595 | 300.424 |
| 8/25/15 | 188.204 | 302.606 |
| 8/26/15 | 187.67 | 302.604 |
| 8/27/15 | 188.019 | 304.35 |
| 8/28/15 | 188.358 | 305.18 |
| 8/31/15 | 188.367 | 305.826 |
| 9/1/15 | 188.247 | 304.962 |
| 9/2/15 | 188.362 | 305.418 |
| 9/3/15 | 188.653 | 306.544 |
| 9/4/15 | 189.01 | 306.28 |
| 9/8/15 | 188.718 | 307.036 |
| 9/9/15 | 188.655 | 307.608 |
| 9/10/15 | 188.494 | 307.246 |
| 9/11/15 | 188.665 | 307.363 |
| 9/14/15 | 188.69 | 307.074 |
| 9/15/15 | 188.159 | 306.609 |
| 9/16/15 | 187.944 | 305.521 |
| 9/17/15 | 188.34 | 305.22 |
| 9/18/15 | 189.306 | 304.649 |
| 9/21/15 | 189.059 | 304.37 |
| 9/22/15 | 189.258 | 302.461 |
| 9/23/15 | 189.047 | 301.926 |
| 9/24/15 | 189.028 | 299.581 |
| 9/25/15 | 188.577 | 299.012 |
| 9/28/15 | 188.471 | 295.006 |
| 9/29/15 | 188.44 | 293.54 |
| 9/30/15 | 188.623 | 294.564 |
| 10/1/15 | 188.623 | 294.486 |
| 10/2/15 | 189.14 | 293.886 |
| 10/5/15 | 189.025 | 296.403 |
| 10/6/15 | 189.276 | 299.244 |
| 10/7/15 | 189.595 | 302.748 |
| 10/8/15 | 189.43 | 302.803 |
| 10/9/15 | 189.435 | 305.191 |
| 10/12/15 | 189.631 | 305.396 |
| 10/13/15 | 189.828 | 304.61 |
| 10/14/15 | 190.284 | 303.801 |
| 10/15/15 | 190.206 | 303.775 |
| 10/16/15 | 190.278 | 305.084 |
| 10/19/15 | 190.23 | 305.351 |
| 10/20/15 | 190.028 | 305.83 |
| 10/21/15 | 190.51 | 306.449 |
| 10/22/15 | 190.755 | 305.933 |
| 10/23/15 | 190.542 | 306.998 |
| 10/26/15 | 190.885 | 307.039 |
| 10/27/15 | 190.974 | 306.329 |
| 10/28/15 | 190.541 | 306.511 |
| 10/29/15 | 189.77 | 306.829 |
| 10/30/15 | 189.791 | 306.783 |
| 11/2/15 | 189.726 | 307.628 |
| 11/3/15 | 189.6 | 308.064 |
| 11/4/15 | 189.523 | 308.412 |
| 11/5/15 | 189.453 | 307.838 |
| 11/6/15 | 188.847 | 306.34 |
| 11/9/15 | 188.6 | 304.619 |
| 11/10/15 | 188.716 | 303.578 |
| 11/11/15 | 188.833 | 303.745 |
| 11/12/15 | 188.608 | 301.988 |
| 11/13/15 | 188.887 | 300.485 |
| 11/16/15 | 189.089 | 299.857 |
| 11/17/15 | 189.003 | 301.109 |
| 11/18/15 | 189.028 | 300.852 |
| 11/19/15 | 189.435 | 299.564 |
| 11/20/15 | 189.385 | 299.468 |
| 11/23/15 | 189.322 | 298.54 |
| 11/24/15 | 189.411 | 297.716 |
| 11/25/15 | 189.478 | 297.794 |
| 11/27/15 | 189.585 | 297.664 |
| 11/30/15 | 189.558 | 298.227 |
| 12/1/15 | 190.086 | 299.118 |
| 12/2/15 | 189.953 | 299.72 |
| 12/3/15 | 188.758 | 298.59 |
| 12/4/15 | 188.919 | 297.419 |
| 12/7/15 | 189.292 | 295.635 |
| 12/8/15 | 188.972 | 293.107 |
| 12/9/15 | 188.913 | 293.184 |
| 12/10/15 | 188.785 | 292.429 |
| 12/11/15 | 188.792 | 288.532 |
| 12/14/15 | 187.841 | 284.516 |
| 12/15/15 | 187.577 | 286.934 |
| 12/16/15 | 187.538 | 288.067 |
| 12/17/15 | 187.998 | 288.032 |
| 12/18/15 | 188.195 | 285.949 |
| 12/21/15 | 188.295 | 285.827 |
| 12/22/15 | 188.067 | 286.645 |
| 12/23/15 | 188.046 | 288.156 |
| 12/24/15 | 188.194 | 288.68 |
| 12/28/15 | 188.439 | 288.682 |
| 12/29/15 | 188.099 | 289.708 |
| 12/30/15 | 188.072 | 289.923 |
| 12/31/15 | 188.32 | 289.896 |
| 1/4/16 | 188.381 | 288.66 |
| 1/5/16 | 188.267 | 290.104 |
| 1/6/16 | 188.652 | 290.134 |
| 1/7/16 | 188.566 | 288.992 |
| 1/8/16 | 188.818 | 289.452 |
| 1/11/16 | 188.546 | 288.696 |
| 1/12/16 | 188.571 | 287.678 |
| 1/13/16 | 188.602 | 286.344 |
| 1/14/16 | 188.152 | 284.133 |
| 1/15/16 | 188.039 | 280.669 |
| 1/19/16 | 187.614 | 276.856 |
| 1/20/16 | 187.117 | 271.948 |
| 1/21/16 | 187.26 | 273.375 |
| 1/22/16 | 187.182 | 276.914 |
| 1/25/16 | 187.235 | 277.728 |
| 1/26/16 | 187.33 | 278.532 |
| 1/27/16 | 187.065 | 279.194 |
| 1/28/16 | 187.241 | 280.568 |
| 1/29/16 | 187.696 | 281.653 |
| 2/1/16 | 187.417 | 281.298 |
| 2/2/16 | 187.72 | 279.608 |
| 2/3/16 | 187.721 | 279.031 |
| 2/4/16 | 187.855 | 279.454 |
| 2/5/16 | 187.886 | 278.382 |
| 2/8/16 | 188.148 | 274.268 |
| 2/9/16 | 187.944 | 272.672 |
| 2/10/16 | 188.182 | 273.675 |
| 2/11/16 | 188.283 | 270.177 |
| 2/12/16 | 187.702 | 271.91 |
| 2/16/16 | 186.961 | 275.607 |
| 2/17/16 | 186.847 | 278.251 |
| 2/18/16 | 187.58 | 279.907 |
| 2/19/16 | 187.713 | 279.41 |
| 2/22/16 | 187.953 | 281.109 |
| 2/23/16 | 188.213 | 280.94 |
| 2/24/16 | 188.406 | 280.202 |
| 2/25/16 | 188.768 | 281.875 |
| 2/26/16 | 188.719 | 284.35 |
| 2/29/16 | 189.189 | 286.89 |
| 3/1/16 | 188.954 | 289.916 |
| 3/2/16 | 188.963 | 291.934 |
| 3/3/16 | 189.401 | 293.172 |
| 3/4/16 | 189.416 | 295.577 |
| 3/7/16 | 189.744 | 296.71 |
| 3/8/16 | 190.57 | 295.553 |
| 3/9/16 | 190.293 | 295.25 |
| 3/10/16 | 190.409 | 296.174 |
| 3/11/16 | 190.761 | 298.865 |
| 3/14/16 | 191.479 | 299.801 |
| 3/15/16 | 191.537 | 298.659 |
| 3/16/16 | 191.56 | 298.253 |
| 3/17/16 | 192.446 | 300.505 |
| 3/18/16 | 192.907 | 302.641 |
| 3/21/16 | 192.959 | 303.17 |
| 3/22/16 | 192.997 | 302.638 |
| 3/23/16 | 193.28 | 301.871 |
| 3/24/16 | 193.171 | 299.546 |
| 3/28/16 | 193.245 | 299.154 |
| 3/29/16 | 193.563 | 298.043 |
| 3/30/16 | 193.762 | 299.745 |
| 3/31/16 | 194.254 | 300.469 |
| 4/1/16 | 194.406 | 300.46 |
| 4/4/16 | 194.67 | 300.708 |
| 4/5/16 | 195.008 | 299.556 |
| 4/6/16 | 194.822 | 300.513 |
| 4/7/16 | 195.213 | 300.205 |
| 4/8/16 | 195.153 | 300.789 |
| 4/11/16 | 195.181 | 301.833 |
| 4/12/16 | 194.982 | 303.31 |
| 4/13/16 | 195.197 | 306.047 |
| 4/14/16 | 195.274 | 307.187 |
| 4/15/16 | 195.76 | 307.333 |
| 4/18/16 | 195.669 | 307.314 |
| 4/19/16 | 196.069 | 309.527 |
| 4/20/16 | 196.195 | 310.94 |
| 4/21/16 | 195.95 | 311.395 |
| 4/22/16 | 195.948 | 311.313 |
| 4/25/16 | 195.881 | 310.737 |
| 4/26/16 | 195.632 | 311.167 |
| 4/27/16 | 195.917 | 312.26 |
| 4/28/16 | 196.362 | 313.686 |
| 4/29/16 | 196.549 | 313.857 |
| 5/2/16 | 196.446 | 314.055 |
| 5/3/16 | 196.722 | 312.471 |
| 5/4/16 | 196.517 | 311.595 |
| 5/5/16 | 196.718 | 311.311 |
| 5/6/16 | 196.537 | 310.262 |
| 5/9/16 | 196.503 | 310.255 |
| 5/10/16 | 196.613 | 310.626 |
| 5/11/16 | 196.745 | 311.706 |
| 5/12/16 | 196.466 | 312.093 |
| 5/13/16 | 196.627 | 311.779 |
| 5/16/16 | 196.451 | 312.491 |
| 5/17/16 | 196.435 | 312.857 |
| 5/18/16 | 195.613 | 312.462 |
| 5/19/16 | 195.235 | 310.91 |
| 5/20/16 | 195.273 | 311.95 |
| 5/23/16 | 195.358 | 312.157 |
| 5/24/16 | 195.211 | 312.655 |
| 5/25/16 | 195.406 | 313.839 |
| 5/26/16 | 195.925 | 314.239 |
| 5/27/16 | 196.054 | 314.412 |
| 5/31/16 | 196.003 | 314.392 |
| 6/1/16 | 196.05 | 313.86 |
| 6/2/16 | 196.396 | 314.467 |
| 6/3/16 | 197.238 | 314.891 |
| 6/6/16 | 197.301 | 316.41 |
| 6/7/16 | 197.59 | 317.7 |
| 6/8/16 | 197.878 | 319.363 |
| 6/9/16 | 198.134 | 319.164 |
| 6/10/16 | 198.171 | 318.061 |
| 6/13/16 | 198.215 | 317.394 |
| 6/14/16 | 197.929 | 315.404 |
| 6/15/16 | 198.124 | 315.892 |
| 6/16/16 | 198.28 | 314.379 |
| 6/17/16 | 198.13 | 315.848 |
| 6/20/16 | 198.048 | 318.301 |
| 6/21/16 | 197.996 | 318.18 |
| 6/22/16 | 198.15 | 319.311 |
| 6/23/16 | 198.125 | 320.382 |
| 6/24/16 | 198.506 | 317.802 |
| 6/27/16 | 199.206 | 315.236 |
| 6/28/16 | 199.586 | 316.453 |
| 6/29/16 | 200.002 | 318.908 |
| 6/30/16 | 200.063 | 319.994 |
| 7/1/16 | 200.739 | 321.77 |
| 7/5/16 | 201.589 | 321.792 |
| 7/6/16 | 201.737 | 321.541 |
| 7/7/16 | 201.963 | 322.797 |
| 7/8/16 | 202.451 | 324.195 |
| 7/11/16 | 202.567 | 326.491 |
| 7/12/16 | 202.068 | 328.452 |
| 7/13/16 | 202.405 | 327.718 |
| 7/14/16 | 201.959 | 328.632 |
| 7/15/16 | 201.512 | 328.373 |
| 7/18/16 | 201.486 | 328.459 |
| 7/19/16 | 201.691 | 328.488 |
| 7/20/16 | 201.545 | 328.895 |
| 7/21/16 | 201.662 | 329.173 |
| 7/22/16 | 201.804 | 329.137 |
| 7/25/16 | 201.753 | 329.349 |
| 7/26/16 | 201.457 | 328.617 |
| 7/27/16 | 201.668 | 328.516 |
| 7/28/16 | 201.757 | 328.132 |
| 7/29/16 | 202.092 | 327.564 |
| 8/1/16 | 201.836 | 327.49 |
| 8/2/16 | 201.18 | 326.651 |
| 8/3/16 | 201.131 | 327.122 |
| 8/4/16 | 201.822 | 328.693 |
| 8/5/16 | 201.538 | 329.878 |
| 8/8/16 | 201.659 | 330.89 |
| 8/9/16 | 202.023 | 332.085 |
| 8/10/16 | 202.581 | 332.279 |
| 8/11/16 | 202.292 | 332.233 |
| 8/12/16 | 202.742 | 332.807 |
| 8/15/16 | 202.494 | 333.604 |
| 8/16/16 | 202.509 | 334.019 |
| 8/17/16 | 202.553 | 333.806 |
| 8/18/16 | 202.914 | 333.971 |
| 8/19/16 | 202.692 | 334.315 |
| 8/22/16 | 203.125 | 334.283 |
| 8/23/16 | 203.296 | 334.651 |
| 8/24/16 | 203.222 | 334.604 |
| 8/25/16 | 202.969 | 334.231 |
| 8/26/16 | 202.916 | 334.548 |
| 8/29/16 | 203.037 | 334.842 |
| 8/30/16 | 203.139 | 335.049 |
| 8/31/16 | 203.059 | 334.78 |
| 9/1/16 | 202.871 | 334.34 |
| 9/2/16 | 202.722 | 334.945 |
| 9/6/16 | 203.041 | 335.237 |
| 9/7/16 | 203.141 | 335.819 |
| 9/8/16 | 202.44 | 335.868 |
| 9/9/16 | 201.432 | 334.347 |
| 9/12/16 | 201.154 | 333.589 |
| 9/13/16 | 200.682 | 332.561 |
| 9/14/16 | 200.787 | 332.394 |
| 9/15/16 | 200.692 | 332.511 |
| 9/16/16 | 200.887 | 332.517 |
| 9/19/16 | 200.964 | 332.846 |
| 9/20/16 | 201.207 | 332.872 |
| 9/21/16 | 201.226 | 333.856 |
| 9/22/16 | 202.184 | 336.064 |
| 9/23/16 | 202.326 | 335.949 |
| 9/26/16 | 202.455 | 335.719 |
| 9/27/16 | 202.606 | 335.487 |
| 9/28/16 | 202.756 | 336.34 |
| 9/29/16 | 202.701 | 337.009 |
| 9/30/16 | 202.541 | 337.519 |
| 10/3/16 | 202.4 | 337.882 |
| 10/4/16 | 202.001 | 338.121 |
| 10/5/16 | 201.601 | 338.475 |
| 10/6/16 | 201.602 | 338.772 |
| 10/7/16 | 201.662 | 338.989 |
| 10/10/16 | 201.736 | 339.286 |
| 10/11/16 | 201.522 | 339.134 |
| 10/12/16 | 201.442 | 339.132 |
| 10/13/16 | 201.856 | 338.688 |
| 10/14/16 | 201.618 | 339.419 |
| 10/17/16 | 201.809 | 339.829 |
| 10/18/16 | 202.078 | 340.389 |
| 10/19/16 | 202.272 | 341.285 |
| 10/20/16 | 202.311 | 341.63 |
| 10/21/16 | 202.223 | 341.668 |
| 10/24/16 | 202.029 | 342.053 |
| 10/25/16 | 201.952 | 341.971 |
| 10/26/16 | 201.472 | 340.997 |
| 10/27/16 | 200.834 | 340.116 |
| 10/28/16 | 200.697 | 339.489 |
| 10/31/16 | 200.748 | 338.526 |
| 11/1/16 | 200.44 | 336.691 |
| 11/2/16 | 200.618 | 334.99 |
| 11/3/16 | 200.52 | 335.281 |
| 11/4/16 | 200.739 | 335.071 |
| 11/7/16 | 200.781 | 337.16 |
| 11/8/16 | 200.576 | 337.354 |
| 11/9/16 | 199.257 | 336.143 |
| 11/10/16 | 198.676 | 334.522 |
| 11/11/16 | 198.706 | 334.383 |
| 11/14/16 | 197.184 | 330.657 |
| 11/15/16 | 197.322 | 332.754 |
| 11/16/16 | 197.312 | 333.201 |
| 11/17/16 | 196.871 | 333.991 |
| 11/18/16 | 196.159 | 333.597 |
| 11/21/16 | 196.094 | 334.144 |
| 11/22/16 | 196.3 | 335.182 |
| 11/23/16 | 195.73 | 335.333 |
| 11/25/16 | 195.865 | 335.383 |
| 11/28/16 | 196.339 | 335.883 |
| 11/29/16 | 196.462 | 335.624 |
| 11/30/16 | 196.205 | 336.247 |
| 12/1/16 | 195.627 | 336.019 |
| 12/2/16 | 196.182 | 336.18 |
| 12/5/16 | 196.294 | 337.066 |
| 12/6/16 | 196.339 | 337.959 |
| 12/7/16 | 196.841 | 339.867 |
| 12/8/16 | 196.496 | 340.184 |
| 12/9/16 | 196.035 | 340.76 |
| 12/12/16 | 195.858 | 341.127 |
| 12/13/16 | 196.093 | 341.508 |
| 12/14/16 | 196.245 | 341.608 |
| 12/15/16 | 195.299 | 339.941 |
| 12/16/16 | 195.344 | 339.965 |
| 12/19/16 | 195.733 | 340.285 |
| 12/20/16 | 195.642 | 340.54 |
| 12/21/16 | 196.013 | 340.808 |
| 12/22/16 | 196.046 | 341.289 |
| 12/23/16 | 196.227 | 341.732 |
| 12/27/16 | 196.231 | 341.945 |
| 12/28/16 | 196.591 | 342.601 |
| 12/29/16 | 197.164 | 342.93 |
| 12/30/16 | 197.407 | 342.84 |
| 1/3/17 | 197.43 | 343.615 |
| 1/4/17 | 197.758 | 344.832 |
| 1/5/17 | 198.38 | 345.866 |
| 1/6/17 | 198.077 | 346.307 |
| 1/9/17 | 198.327 | 346.697 |
| 1/10/17 | 198.229 | 346.909 |
| 1/11/17 | 198.285 | 346.579 |
| 1/12/17 | 198.625 | 346.694 |
| 1/13/17 | 198.14 | 346.967 |
| 1/17/17 | 198.169 | 347.368 |
| 1/18/17 | 197.652 | 347.15 |
| 1/19/17 | 196.942 | 346.534 |
| 1/20/17 | 196.891 | 346.39 |
| 1/23/17 | 197.622 | 346.514 |
| 1/24/17 | 197.329 | 346.954 |
| 1/25/17 | 196.872 | 347.446 |
| 1/26/17 | 196.877 | 347.852 |
| 1/27/17 | 197.185 | 348.198 |
| 1/30/17 | 197.071 | 348.126 |
| 1/31/17 | 197.244 | 348.14 |
| 2/1/17 | 196.936 | 348.45 |
| 2/2/17 | 197.29 | 348.968 |
| 2/3/17 | 197.513 | 349.807 |
| 2/6/17 | 197.842 | 350.277 |
| 2/7/17 | 198.047 | 350.135 |
| 2/8/17 | 198.355 | 349.51 |
| 2/9/17 | 198.049 | 349.602 |
| 2/10/17 | 197.918 | 350.228 |
| 2/13/17 | 197.874 | 350.803 |
| 2/14/17 | 197.64 | 350.922 |
| 2/15/17 | 197.427 | 350.891 |
| 2/16/17 | 197.929 | 350.971 |
| 2/17/17 | 198.216 | 351.087 |
| 2/21/17 | 198.247 | 351.833 |
| 2/22/17 | 198.308 | 352.379 |
| 2/23/17 | 198.751 | 352.958 |
| 2/24/17 | 199.301 | 352.929 |
| 2/27/17 | 199.267 | 353.359 |
| 2/28/17 | 199.286 | 353.461 |
| 3/1/17 | 198.425 | 354.46 |
| 3/2/17 | 198.224 | 354.143 |
| 3/3/17 | 198.231 | 353.795 |
| 3/6/17 | 198.231 | 353.159 |
| 3/7/17 | 197.839 | 352.055 |
| 3/8/17 | 197.117 | 350.522 |
| 3/9/17 | 196.55 | 348.487 |
| 3/10/17 | 196.694 | 349.078 |
| 3/13/17 | 196.517 | 348.476 |
| 3/14/17 | 196.426 | 347.13 |
| 3/15/17 | 196.905 | 348.321 |
| 3/16/17 | 197.461 | 350.636 |
| 3/17/17 | 197.728 | 350.523 |
| 3/20/17 | 197.976 | 350.244 |
| 3/21/17 | 198.383 | 349.661 |
| 3/22/17 | 198.622 | 348.392 |
| 3/23/17 | 198.587 | 348.921 |
| 3/24/17 | 198.773 | 349.695 |
| 3/27/17 | 199.054 | 349.587 |
| 3/28/17 | 198.938 | 350.707 |
| 3/29/17 | 199.127 | 351.898 |
| 3/30/17 | 198.976 | 353.046 |
| 3/31/17 | 198.967 | 353.575 |
| 4/3/17 | 199.465 | 353.838 |
| 4/4/17 | 199.473 | 353.816 |
| 4/5/17 | 199.484 | 354.476 |
| 4/6/17 | 199.567 | 354.628 |
| 4/7/17 | 199.687 | 354.912 |
| 4/10/17 | 199.62 | 355.105 |
| 4/11/17 | 200.078 | 355.238 |
| 4/12/17 | 200.335 | 354.927 |
| 4/13/17 | 200.61 | 354.929 |
| 4/17/17 | 200.742 | 354.947 |
| 4/18/17 | 201.126 | 354.749 |
| 4/19/17 | 201.039 | 355.092 |
| 4/20/17 | 200.738 | 355.14 |
| 4/21/17 | 200.93 | 355.439 |
| 4/24/17 | 200.6 | 356.018 |
| 4/25/17 | 200.334 | 356.288 |
| 4/26/17 | 200.283 | 356.56 |
| 4/27/17 | 200.577 | 356.729 |
| 4/28/17 | 200.59 | 357.087 |
| 5/1/17 | 200.509 | 357.288 |
| 5/2/17 | 200.667 | 357.643 |
| 5/3/17 | 200.874 | 357.587 |
| 5/4/17 | 200.339 | 356.477 |
| 5/5/17 | 200.425 | 356.226 |
| 5/8/17 | 200.272 | 356.449 |
| 5/9/17 | 200.145 | 356.371 |
| 5/10/17 | 200.396 | 356.613 |
| 5/11/17 | 200.418 | 356.827 |
| 5/12/17 | 201.049 | 357.687 |
| 5/15/17 | 201.225 | 358.284 |
| 5/16/17 | 201.4 | 358.483 |
| 5/17/17 | 202.07 | 358.192 |
| 5/18/17 | 202.097 | 357.132 |
| 5/19/17 | 202.084 | 358.198 |
| 5/22/17 | 202.173 | 358.74 |
| 5/23/17 | 201.965 | 358.83 |
| 5/24/17 | 201.797 | 359.157 |
| 5/25/17 | 201.88 | 359.424 |
| 5/26/17 | 202.142 | 359.498 |
| 5/30/17 | 202.338 | 359.772 |
| 5/31/17 | 202.493 | 359.658 |
| 6/1/17 | 202.403 | 359.892 |
| 6/2/17 | 202.989 | 360.435 |
| 6/5/17 | 202.966 | 360.48 |
| 6/6/17 | 203.324 | 360.493 |
| 6/7/17 | 203.138 | 360.17 |
| 6/8/17 | 202.843 | 359.48 |
| 6/9/17 | 202.71 | 359.563 |
| 6/12/17 | 202.782 | 359.812 |
| 6/13/17 | 202.819 | 360.223 |
| 6/14/17 | 203.663 | 360.576 |
| 6/15/17 | 203.446 | 360.163 |
| 6/16/17 | 203.555 | 359.961 |
| 6/19/17 | 203.462 | 360.106 |
| 6/20/17 | 203.648 | 359.217 |
| 6/21/17 | 203.684 | 358.429 |
| 6/22/17 | 203.8 | 358.065 |
| 6/23/17 | 203.873 | 358.472 |
| 6/26/17 | 204.216 | 359.174 |
| 6/27/17 | 203.689 | 359.208 |
| 6/28/17 | 203.589 | 359.381 |
| 6/29/17 | 203.322 | 359.377 |
| 6/30/17 | 203.285 | 359.583 |
| 7/3/17 | 203.108 | 359.782 |
| 7/5/17 | 202.972 | 359.598 |
| 7/6/17 | 202.698 | 358.856 |
| 7/7/17 | 202.619 | 358.285 |
| 7/10/17 | 202.891 | 358.575 |
| 7/11/17 | 202.912 | 358.677 |
| 7/12/17 | 203.439 | 359.724 |
| 7/13/17 | 203.264 | 359.833 |
| 7/14/17 | 203.603 | 360.614 |
| 7/17/17 | 203.737 | 361.435 |
| 7/18/17 | 204.228 | 361.793 |
| 7/19/17 | 204.34 | 362.37 |
| 7/20/17 | 204.539 | 362.884 |
| 7/21/17 | 204.801 | 362.818 |
| 7/24/17 | 204.668 | 362.997 |
| 7/25/17 | 204.056 | 362.902 |
| 7/26/17 | 204.125 | 363.404 |
| 7/27/17 | 204.134 | 363.405 |
| 7/28/17 | 204.328 | 363.531 |
| 7/31/17 | 204.413 | 363.556 |
| 8/1/17 | 204.707 | 363.713 |
| 8/2/17 | 204.75 | 363.821 |
| 8/3/17 | 204.853 | 363.671 |
| 8/4/17 | 204.488 | 363.324 |
| 8/7/17 | 204.49 | 363.558 |
| 8/8/17 | 204.185 | 363.087 |
| 8/9/17 | 204.147 | 361.804 |
| 8/10/17 | 204.054 | 360.703 |
| 8/11/17 | 204.041 | 360.437 |
| 8/14/17 | 204.266 | 361.371 |
| 8/15/17 | 204.078 | 361.32 |
| 8/16/17 | 204.306 | 361.514 |
| 8/17/17 | 204.556 | 361.293 |
| 8/18/17 | 204.624 | 360.717 |
| 8/21/17 | 204.71 | 361.038 |
| 8/22/17 | 204.563 | 361.391 |
| 8/23/17 | 204.841 | 361.447 |
| 8/24/17 | 204.85 | 361.979 |
| 8/25/17 | 204.999 | 362.377 |
| 8/28/17 | 205.148 | 362.764 |
| 8/29/17 | 205.368 | 362.912 |
| 8/30/17 | 205.298 | 363.254 |
| 8/31/17 | 205.497 | 364.065 |
| 9/1/17 | 205.422 | 364.417 |
| 9/5/17 | 205.84 | 364.655 |
| 9/6/17 | 205.756 | 364.724 |
| 9/7/17 | 205.946 | 364.736 |
| 9/8/17 | 205.79 | 364.407 |
| 9/11/17 | 205.368 | 364.439 |
| 9/12/17 | 205.091 | 364.454 |
| 9/13/17 | 205.087 | 364.749 |
| 9/14/17 | 205.089 | 364.887 |
| 9/15/17 | 205.276 | 364.962 |
| 9/18/17 | 205.242 | 365.376 |
| 9/19/17 | 205.301 | 365.589 |
| 9/20/17 | 205.237 | 365.623 |
| 9/21/17 | 205.125 | 365.342 |
| 9/22/17 | 205.239 | 365.571 |
| 9/25/17 | 205.612 | 365.876 |
| 9/26/17 | 205.635 | 366.23 |
| 9/27/17 | 205.16 | 366 |
| 9/28/17 | 205.243 | 366.276 |
| 9/29/17 | 205.521 | 366.805 |
| 10/2/17 | 205.631 | 367.012 |
| 10/3/17 | 205.83 | 367.419 |
| 10/4/17 | 205.767 | 367.45 |
| 10/5/17 | 205.659 | 367.693 |
| 10/6/17 | 205.474 | 367.479 |
| 10/9/17 | 205.566 | 367.715 |
| 10/10/17 | 205.769 | 367.888 |
| 10/11/17 | 205.702 | 367.873 |
| 10/12/17 | 205.671 | 367.653 |
| 10/13/17 | 206.123 | 367.686 |
| 10/16/17 | 206.097 | 368.033 |
| 10/17/17 | 206.026 | 368.276 |
| 10/18/17 | 205.774 | 368.357 |
| 10/19/17 | 205.998 | 368.629 |
| 10/20/17 | 205.649 | 368.624 |
| 10/23/17 | 205.843 | 368.998 |
| 10/24/17 | 205.565 | 368.765 |
| 10/25/17 | 205.144 | 368.013 |
| 10/26/17 | 205.148 | 367.99 |
| 10/27/17 | 205.331 | 367.842 |
| 10/30/17 | 205.802 | 367.967 |
| 10/31/17 | 205.723 | 368.114 |
| 11/1/17 | 205.824 | 368.183 |
| 11/2/17 | 205.795 | 367.927 |
| 11/3/17 | 205.836 | 368 |
| 11/6/17 | 205.9 | 367.743 |
| 11/7/17 | 205.749 | 367.284 |
| 11/8/17 | 205.649 | 366.063 |
| 11/9/17 | 205.288 | 364.573 |
| 11/10/17 | 204.603 | 364.356 |
| 11/13/17 | 204.652 | 364.318 |
| 11/14/17 | 204.691 | 363.502 |
| 11/15/17 | 204.882 | 362.511 |
| 11/16/17 | 204.979 | 364.571 |
| 11/17/17 | 205.199 | 364.981 |
| 11/20/17 | 205.18 | 365.304 |
| 11/21/17 | 205.516 | 365.757 |
| 11/22/17 | 205.835 | 366.155 |
| 11/24/17 | 205.943 | 366.543 |
| 11/27/17 | 205.966 | 366.761 |
| 11/28/17 | 206.095 | 366.796 |
| 11/29/17 | 205.654 | 366.824 |
| 11/30/17 | 205.486 | 366.767 |
| 12/1/17 | 205.92 | 367.053 |
| 12/4/17 | 205.936 | 367.213 |
| 12/5/17 | 206.193 | 367.502 |
| 12/6/17 | 206.601 | 367.317 |
| 12/7/17 | 206.335 | 366.974 |
| 12/8/17 | 206.076 | 366.87 |
| 12/11/17 | 206.204 | 367.016 |
| 12/12/17 | 206.011 | 367.197 |
| 12/13/17 | 206.421 | 367.425 |
| 12/14/17 | 206.69 | 367.409 |
| 12/15/17 | 206.786 | 367.316 |
| 12/18/17 | 206.647 | 367.124 |
| 12/19/17 | 206.018 | 366.974 |
| 12/20/17 | 205.63 | 366.619 |
| 12/21/17 | 205.761 | 366.887 |
| 12/22/17 | 205.837 | 366.991 |
| 12/26/17 | 205.984 | 367.186 |
| 12/27/17 | 206.535 | 367.226 |
| 12/28/17 | 206.756 | 367.69 |
| 12/29/17 | 206.865 | 367.892 |